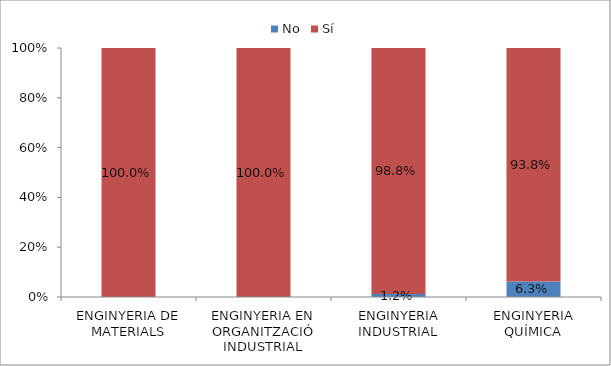
| Category | No | Sí |
|---|---|---|
| ENGINYERIA DE MATERIALS | 0 | 1 |
| ENGINYERIA EN ORGANITZACIÓ INDUSTRIAL | 0 | 1 |
| ENGINYERIA INDUSTRIAL | 0.012 | 0.988 |
| ENGINYERIA QUÍMICA | 0.062 | 0.938 |